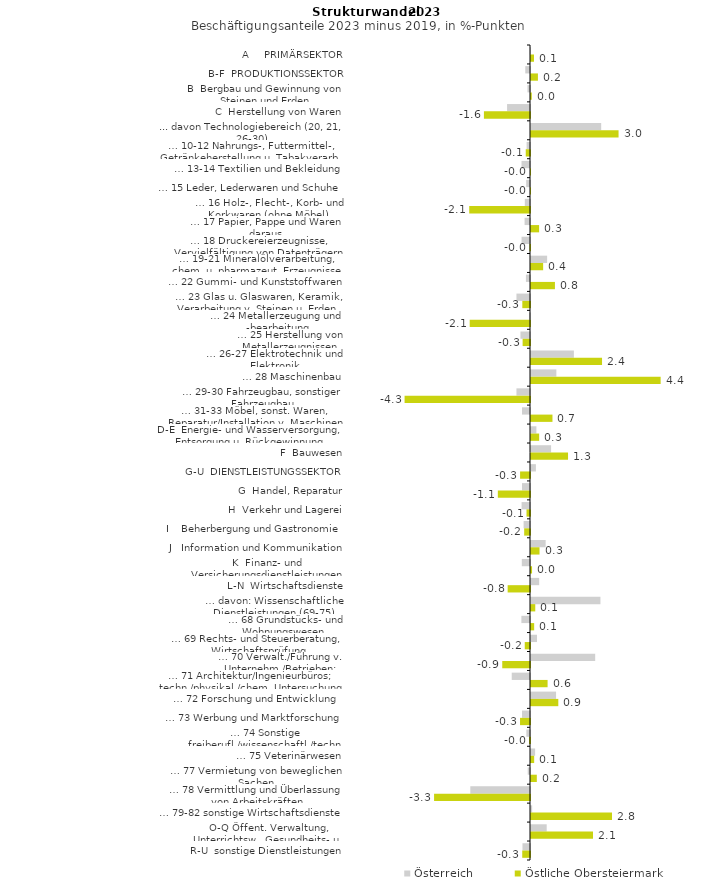
| Category | Österreich | Östliche Obersteiermark |
|---|---|---|
| A     PRIMÄRSEKTOR | -0.007 | 0.102 |
| B-F  PRODUKTIONSSEKTOR | -0.161 | 0.236 |
| B  Bergbau und Gewinnung von Steinen und Erden | -0.086 | 0.026 |
| C  Herstellung von Waren | -0.782 | -1.571 |
| ... davon Technologiebereich (20, 21, 26-30) | 2.393 | 2.985 |
| … 10-12 Nahrungs-, Futtermittel-, Getränkeherstellung u. Tabakverarb. | -0.116 | -0.145 |
| … 13-14 Textilien und Bekleidung | -0.289 | 0 |
| … 15 Leder, Lederwaren und Schuhe | -0.13 | 0 |
| … 16 Holz-, Flecht-, Korb- und Korkwaren (ohne Möbel)  | -0.177 | -2.072 |
| … 17 Papier, Pappe und Waren daraus  | -0.185 | 0.276 |
| … 18 Druckereierzeugnisse, Vervielfältigung von Datenträgern | -0.288 | -0.018 |
| … 19-21 Mineralölverarbeitung, chem. u. pharmazeut. Erzeugnisse | 0.549 | 0.414 |
| … 22 Gummi- und Kunststoffwaren | -0.139 | 0.816 |
| … 23 Glas u. Glaswaren, Keramik, Verarbeitung v. Steinen u. Erden  | -0.462 | -0.262 |
| … 24 Metallerzeugung und -bearbeitung | -0.032 | -2.055 |
| … 25 Herstellung von Metallerzeugnissen  | -0.325 | -0.252 |
| … 26-27 Elektrotechnik und Elektronik | 1.462 | 2.422 |
| … 28 Maschinenbau | 0.864 | 4.42 |
| … 29-30 Fahrzeugbau, sonstiger Fahrzeugbau | -0.462 | -4.276 |
| … 31-33 Möbel, sonst. Waren, Reparatur/Installation v. Maschinen | -0.273 | 0.732 |
| D-E  Energie- und Wasserversorgung, Entsorgung u. Rückgewinnung | 0.184 | 0.278 |
| F  Bauwesen | 0.684 | 1.263 |
| G-U  DIENSTLEISTUNGSSEKTOR | 0.167 | -0.338 |
| G  Handel, Reparatur | -0.273 | -1.097 |
| H  Verkehr und Lagerei | -0.287 | -0.119 |
| I    Beherbergung und Gastronomie | -0.218 | -0.198 |
| J   Information und Kommunikation | 0.499 | 0.291 |
| K  Finanz- und Versicherungsdienstleistungen | -0.279 | 0.036 |
| L-N  Wirtschaftsdienste | 0.279 | -0.762 |
| … davon: Wissenschaftliche Dienstleistungen (69-75) | 2.367 | 0.145 |
| … 68 Grundstücks- und Wohnungswesen  | -0.294 | 0.108 |
| … 69 Rechts- und Steuerberatung, Wirtschaftsprüfung | 0.205 | -0.179 |
| … 70 Verwalt./Führung v. Unternehm./Betrieben; Unternehmensberat. | 2.188 | -0.946 |
| … 71 Architektur/Ingenieurbüros; techn./physikal./chem. Untersuchung | -0.622 | 0.566 |
| … 72 Forschung und Entwicklung  | 0.854 | 0.931 |
| … 73 Werbung und Marktforschung | -0.273 | -0.34 |
| … 74 Sonstige freiberufl./wissenschaftl./techn. Tätigkeiten | -0.124 | -0.033 |
| … 75 Veterinärwesen | 0.14 | 0.108 |
| … 77 Vermietung von beweglichen Sachen  | -0.077 | 0.198 |
| … 78 Vermittlung und Überlassung von Arbeitskräften | -2.035 | -3.27 |
| … 79-82 sonstige Wirtschaftsdienste | 0.039 | 2.761 |
| O-Q Öffent. Verwaltung, Unterrichtsw., Gesundheits- u. Sozialwesen | 0.535 | 2.114 |
| R-U  sonstige Dienstleistungen | -0.256 | -0.265 |